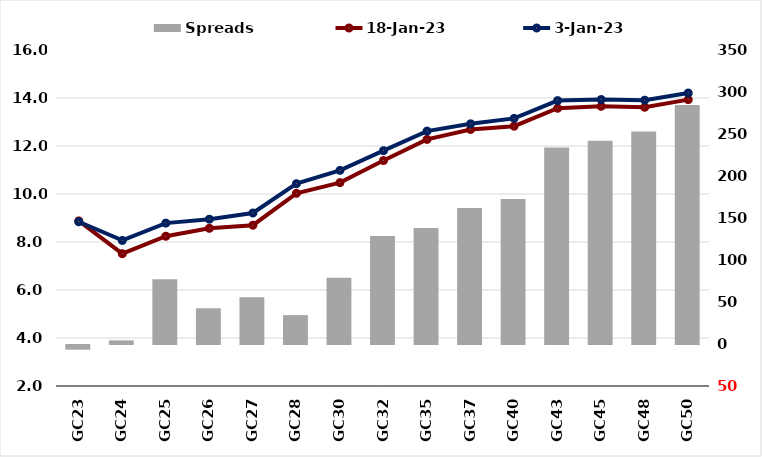
| Category |  Spreads   |
|---|---|
| GC23 | -5.565 |
| GC24 | 4.296 |
| GC25 | 76.996 |
| GC26 | 42.494 |
| GC27 | 55.561 |
| GC28 | 34.393 |
| GC30 | 78.989 |
| GC32 | 128.549 |
| GC35 | 137.948 |
| GC37 | 161.85 |
| GC40 | 172.575 |
| GC43 | 233.843 |
| GC45 | 241.943 |
| GC48 | 252.966 |
| GC50 | 284.617 |